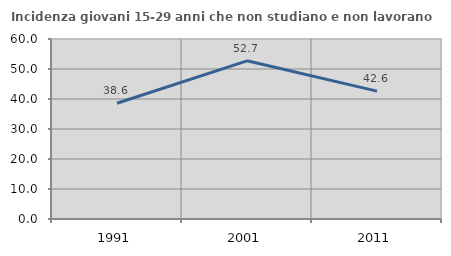
| Category | Incidenza giovani 15-29 anni che non studiano e non lavorano  |
|---|---|
| 1991.0 | 38.592 |
| 2001.0 | 52.722 |
| 2011.0 | 42.629 |